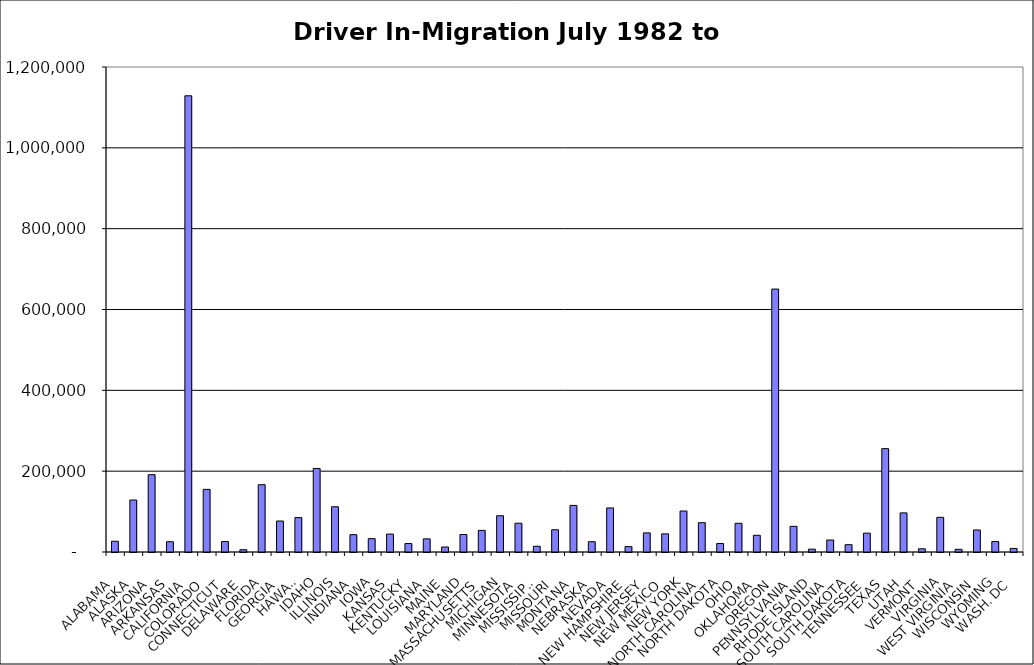
| Category | Series 0 |
|---|---|
| ALABAMA | 26542.5 |
| ALASKA | 128611.5 |
| ARIZONA | 191284 |
| ARKANSAS | 25417.5 |
| CALIFORNIA | 1128712.5 |
| COLORADO | 154963 |
| CONNECTICUT | 25845 |
| DELAWARE | 5675.5 |
| FLORIDA | 166509 |
| GEORGIA | 76631 |
| HAWAII | 85170.5 |
| IDAHO | 206704.5 |
| ILLINOIS | 111967.5 |
| INDIANA | 42839 |
| IOWA | 33060.5 |
| KANSAS | 44309.5 |
| KENTUCKY | 21014 |
| LOUISIANA | 32490.5 |
| MAINE | 12351.5 |
| MARYLAND | 43270 |
| MASSACHUSETTS | 53470 |
| MICHIGAN | 89667 |
| MINNESOTA | 71203.5 |
| MISSISSIPPI | 14182 |
| MISSOURI | 55042 |
| MONTANA | 115269 |
| NEBRASKA | 25442.5 |
| NEVADA | 108998 |
| NEW HAMPSHIRE | 13332.5 |
| NEW JERSEY | 47252 |
| NEW MEXICO | 44831 |
| NEW YORK | 101438 |
| NORTH CAROLINA | 72501.5 |
| NORTH DAKOTA | 20963.5 |
| OHIO | 71010.5 |
| OKLAHOMA | 41353 |
| OREGON | 650554 |
| PENNSYLVANIA | 63504.5 |
| RHODE ISLAND | 7036 |
| SOUTH CAROLINA | 29677.5 |
| SOUTH DAKOTA | 18120.5 |
| TENNESSEE | 46669.5 |
| TEXAS | 255768 |
| UTAH | 96757.5 |
| VERMONT | 7869 |
| VIRGINIA | 85756 |
| WEST VIRGINIA | 6647.5 |
| WISCONSIN | 54461.5 |
| WYOMING | 25899 |
| WASH. DC | 8842 |